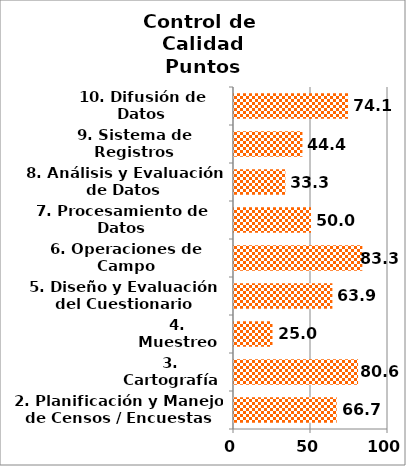
| Category | Series 0 |
|---|---|
| 2. Planificación y Manejo de Censos / Encuestas | 66.667 |
| 3. Cartografía | 80.556 |
| 4. Muestreo | 25 |
| 5. Diseño y Evaluación del Cuestionario | 63.889 |
| 6. Operaciones de Campo | 83.333 |
| 7. Procesamiento de Datos | 50 |
| 8. Análisis y Evaluación de Datos | 33.333 |
| 9. Sistema de Registros Administrativos | 44.444 |
| 10. Difusión de Datos | 74.074 |